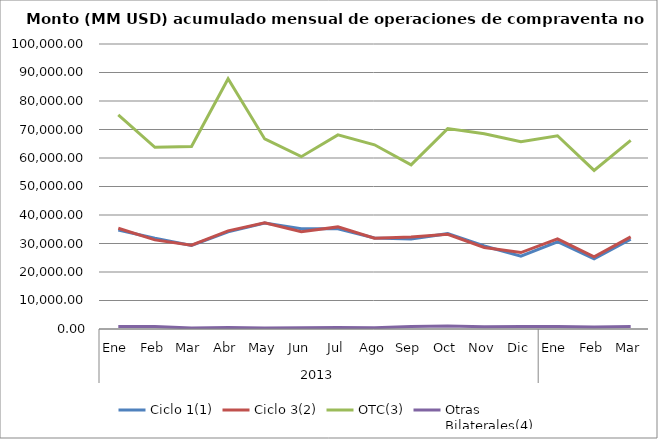
| Category | Ciclo 1(1) | Ciclo 3(2) | OTC(3) | Otras
Bilaterales(4) |
|---|---|---|---|---|
| 0 | 34736.674 | 35336.778 | 75100.994 | 862.558 |
| 1 | 31837.301 | 31276.084 | 63735.014 | 835.426 |
| 2 | 29308.645 | 29417.861 | 64070.642 | 371.583 |
| 3 | 34083.554 | 34428.23 | 87796.406 | 540.738 |
| 4 | 37163.38 | 37242.543 | 66687.424 | 368.797 |
| 5 | 35163.266 | 34165.361 | 60467.987 | 473.52 |
| 6 | 35197.057 | 35828.881 | 68121.887 | 537.978 |
| 7 | 31913.776 | 31846.832 | 64630.867 | 477.656 |
| 8 | 31601.855 | 32260.646 | 57599.123 | 864.94 |
| 9 | 33455.872 | 33201.092 | 70316.044 | 1074.052 |
| 10 | 29141.89 | 28620.849 | 68482.193 | 758.559 |
| 11 | 25532.796 | 26816.016 | 65678.317 | 842.072 |
| 12 | 30609.998 | 31608.391 | 67807.808 | 838.473 |
| 13 | 24661.445 | 25355.64 | 55646.165 | 717.558 |
| 14 | 31490.456 | 32327.003 | 66188.016 | 905.778 |